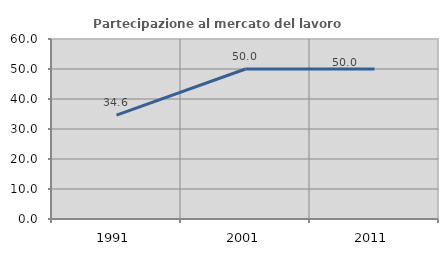
| Category | Partecipazione al mercato del lavoro  femminile |
|---|---|
| 1991.0 | 34.615 |
| 2001.0 | 50 |
| 2011.0 | 50 |